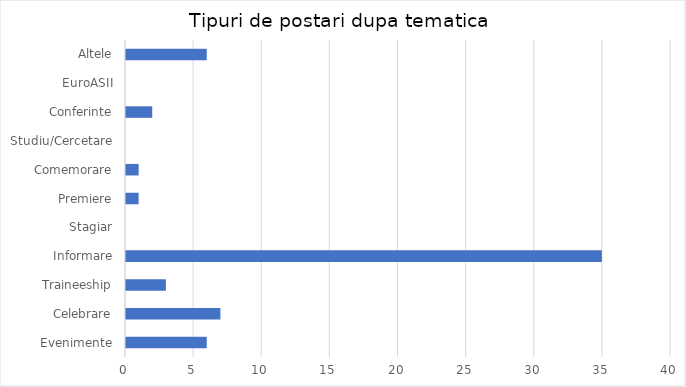
| Category | Series 0 |
|---|---|
| Evenimente | 6 |
| Celebrare | 7 |
| Traineeship | 3 |
| Informare | 35 |
| Stagiar | 0 |
| Premiere | 1 |
| Comemorare | 1 |
| Studiu/Cercetare | 0 |
| Conferinte | 2 |
| EuroASII | 0 |
| Altele | 6 |